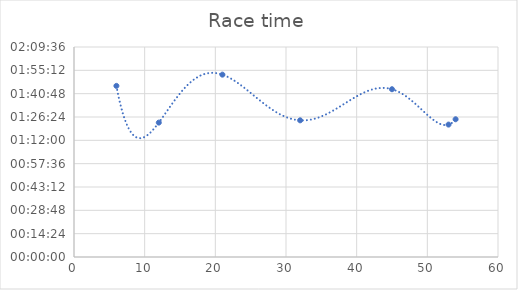
| Category | Race time |
|---|---|
| 12.0 | 0.058 |
| 54.0 | 0.059 |
| 6.0 | 0.073 |
| 21.0 | 0.078 |
| 45.0 | 0.072 |
| 32.0 | 0.059 |
| 53.0 | 0.057 |